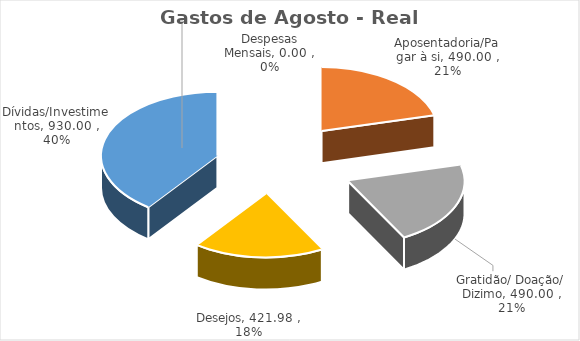
| Category | Gastos de Agosto - Real Acumulado |
|---|---|
| Despesas Mensais | 0 |
| Aposentadoria/Pagar à si | 490 |
| Gratidão/ Doação/ Dizimo | 490 |
| Desejos | 421.98 |
| Dívidas/Investimentos | 930 |